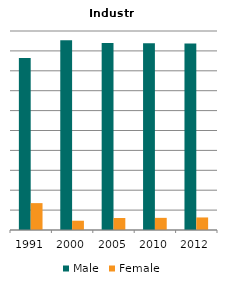
| Category | Male | Female |
|---|---|---|
| 1991.0 | 0.865 | 0.135 |
| 2000.0 | 0.953 | 0.047 |
| 2005.0 | 0.94 | 0.06 |
| 2010.0 | 0.939 | 0.061 |
| 2012.0 | 0.937 | 0.063 |